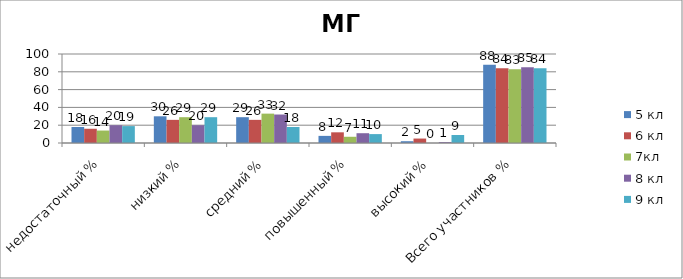
| Category | 5 кл | 6 кл | 7кл | 8 кл | 9 кл |
|---|---|---|---|---|---|
| недостаточный % | 18 | 16 | 14 | 20 | 19 |
| низкий % | 30 | 26 | 29 | 20 | 29 |
| средний % | 29 | 26 | 33 | 32 | 18 |
| повышенный % | 8 | 12 | 7 | 11 | 10 |
| высокий % | 2 | 5 | 0 | 1 | 9 |
| Всего участников % | 88 | 84 | 83 | 85 | 84 |